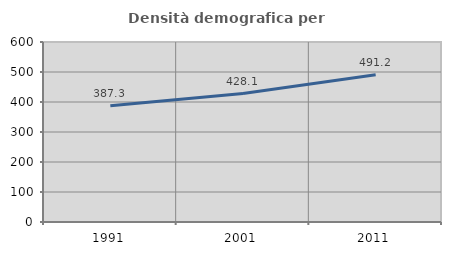
| Category | Densità demografica |
|---|---|
| 1991.0 | 387.27 |
| 2001.0 | 428.051 |
| 2011.0 | 491.167 |